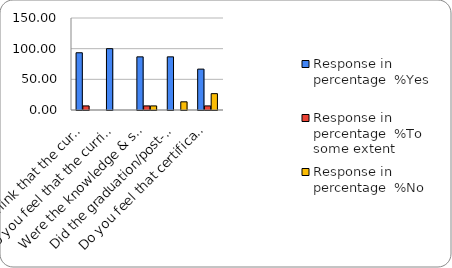
| Category | Response in percentage  |
|---|---|
| Do you think that the curriculum which you had during your graduation/post graduation has provided you with the knowledge & skills necessary to get employed/Self-employed or start own business? | 0 |
| Do you feel that the curriculum you studied is helpful in progression to higher studies? | 0 |
| Were the knowledge & skills acquired through the curriculum useful to you while working on the job?   | 6.667 |
| Did the graduation/post-graduation programme bring about any attitudinal and behavioural change in you? | 13.333 |
| Do you feel that certificate/ diploma courses offered by the college in addition to the curriculum lead to better career prospects? | 26.667 |